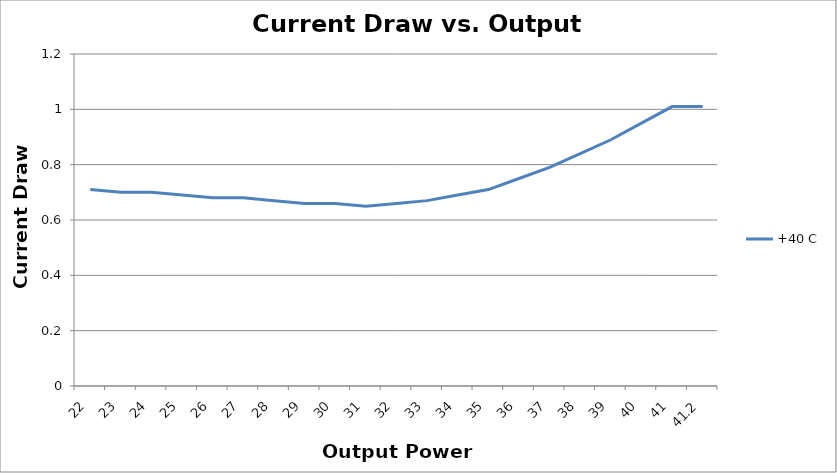
| Category | +40 C |
|---|---|
| 22.0 | 0.71 |
| 23.0 | 0.7 |
| 24.0 | 0.7 |
| 25.0 | 0.69 |
| 26.0 | 0.68 |
| 27.0 | 0.68 |
| 28.0 | 0.67 |
| 29.0 | 0.66 |
| 30.0 | 0.66 |
| 31.0 | 0.65 |
| 32.0 | 0.66 |
| 33.0 | 0.67 |
| 34.0 | 0.69 |
| 35.0 | 0.71 |
| 36.0 | 0.75 |
| 37.0 | 0.79 |
| 38.0 | 0.84 |
| 39.0 | 0.89 |
| 40.0 | 0.95 |
| 41.0 | 1.01 |
| 41.2 | 1.01 |